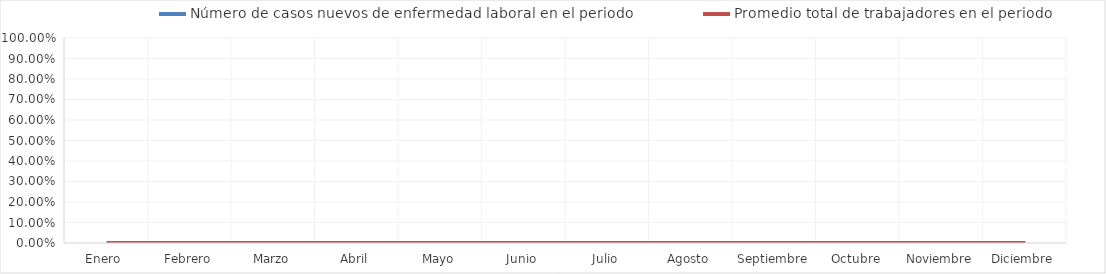
| Category | Número de casos nuevos de enfermedad laboral en el periodo | Promedio total de trabajadores en el periodo |
|---|---|---|
| Enero  | 0 | 0 |
| Febrero | 0 | 0 |
| Marzo | 0 | 0 |
| Abril | 0 | 0 |
| Mayo | 0 | 0 |
| Junio | 0 | 0 |
| Julio | 0 | 0 |
| Agosto | 0 | 0 |
| Septiembre | 0 | 0 |
| Octubre | 0 | 0 |
| Noviembre | 0 | 0 |
| Diciembre | 0 | 0 |